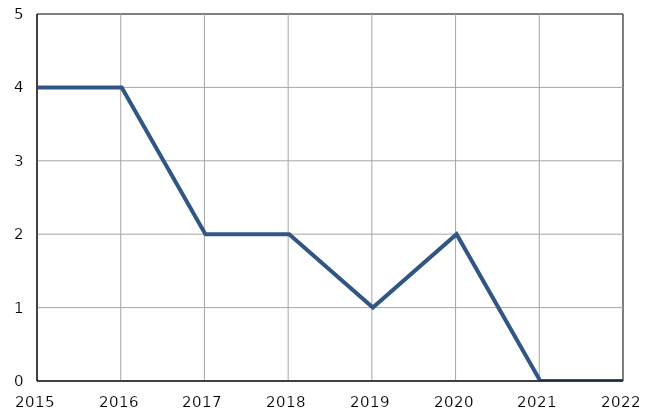
| Category | Infants
deaths |
|---|---|
| 2015.0 | 4 |
| 2016.0 | 4 |
| 2017.0 | 2 |
| 2018.0 | 2 |
| 2019.0 | 1 |
| 2020.0 | 2 |
| 2021.0 | 0 |
| 2022.0 | 0 |